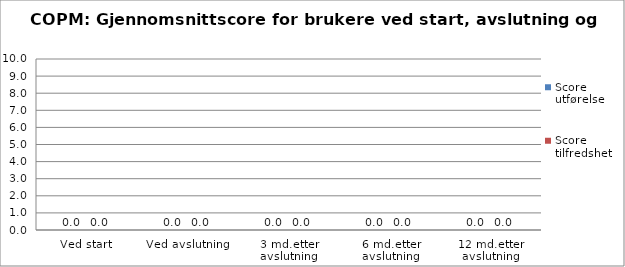
| Category | Score utførelse | Score tilfredshet |
|---|---|---|
| Ved start | 0 | 0 |
| Ved avslutning | 0 | 0 |
| 3 md.etter avslutning | 0 | 0 |
| 6 md.etter avslutning | 0 | 0 |
| 12 md.etter avslutning | 0 | 0 |